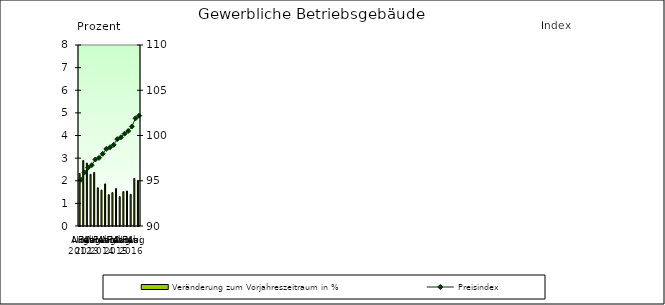
| Category | Veränderung zum Vorjahreszeitraum in % |
|---|---|
| 0 | 2.323 |
| 1 | 2.896 |
| 2 | 2.78 |
| 3 | 2.284 |
| 4 | 2.365 |
| 5 | 1.689 |
| 6 | 1.586 |
| 7 | 1.86 |
| 8 | 1.386 |
| 9 | 1.476 |
| 10 | 1.653 |
| 11 | 1.299 |
| 12 | 1.519 |
| 13 | 1.546 |
| 14 | 1.4 |
| 15 | 2.1 |
| 16 | 2 |